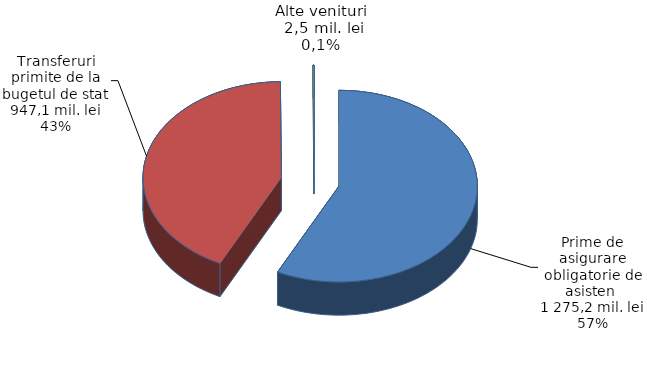
| Category | Series 0 |
|---|---|
| Contibutii | 1275.2 |
| Transferuri | 947.1 |
| Alte venituri | 2.5 |